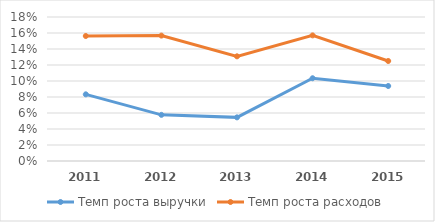
| Category | Темп роста выручки | Темп роста расходов |
|---|---|---|
| 2011.0 | 0.083 | 0.156 |
| 2012.0 | 0.058 | 0.157 |
| 2013.0 | 0.055 | 0.131 |
| 2014.0 | 0.103 | 0.157 |
| 2015.0 | 0.094 | 0.125 |